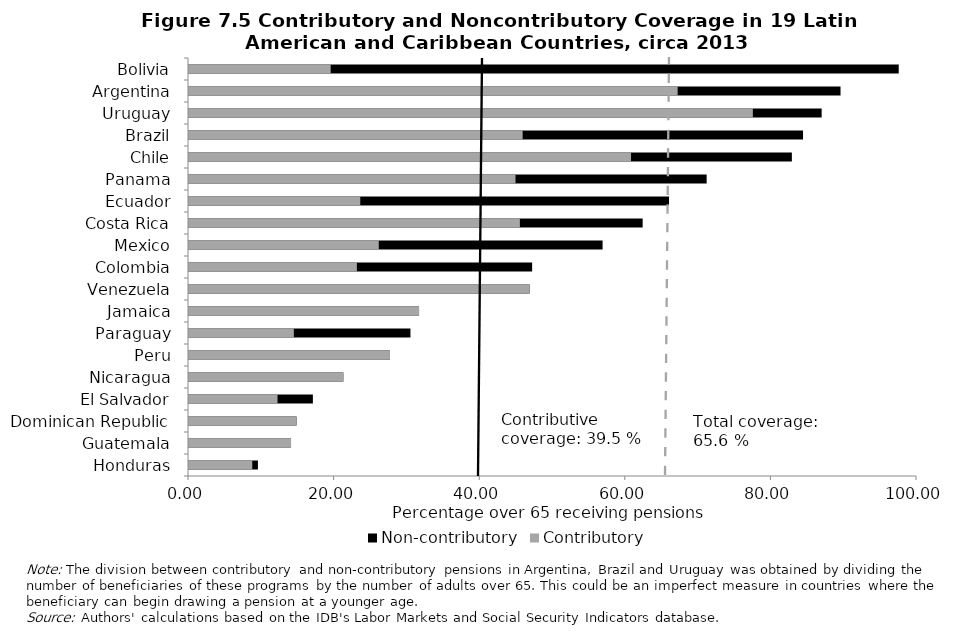
| Category | Non-contributory | Contributory |
|---|---|---|
| Honduras | 9.47 | 8.69 |
| Guatemala | 14.015 | 14.015 |
| Dominican Republic | 14.766 | 14.766 |
| El Salvador | 17.017 | 12.161 |
| Nicaragua | 21.199 | 21.199 |
| Peru | 27.606 | 27.606 |
| Paraguay | 30.419 | 14.402 |
| Jamaica | 31.6 | 31.6 |
| Venezuela | 46.783 | 46.783 |
| Colombia | 47.132 | 23.063 |
| Mexico | 56.812 | 26.071 |
| Costa Rica | 62.316 | 45.453 |
| Ecuador | 65.936 | 23.524 |
| Panama | 71.105 | 44.853 |
| Chile | 82.811 | 60.718 |
| Brazil | 84.347 | 45.833 |
| Uruguay | 86.903 | 77.454 |
| Argentina | 89.496 | 67.122 |
| Bolivia | 97.49 | 19.464 |